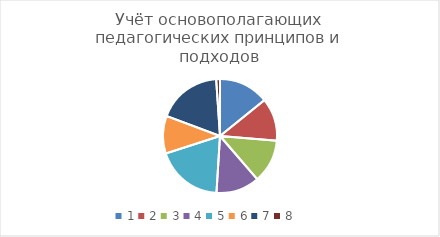
| Category | Series 0 |
|---|---|
| 0 | 0.213 |
| 1 | 0.182 |
| 2 | 0.186 |
| 3 | 0.185 |
| 4 | 0.286 |
| 5 | 0.161 |
| 6 | 0.274 |
| 7 | 0.016 |